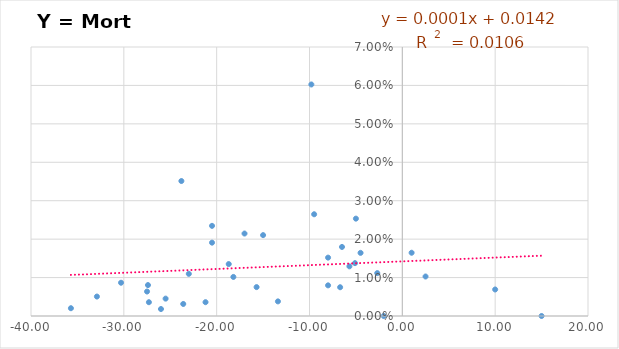
| Category | Y = Mort /año |
|---|---|
| 10.0 | 0.007 |
| -30.30000000000001 | 0.009 |
| -15.0 | 0.021 |
| -23.0 | 0.011 |
| -8.0 | 0.015 |
| -4.5 | 0.016 |
| -6.699999999999989 | 0.007 |
| -8.0 | 0.008 |
| -35.69999999999999 | 0.002 |
| -27.30000000000001 | 0.004 |
| -18.69999999999999 | 0.014 |
| -32.900000000000006 | 0.005 |
| -20.5 | 0.023 |
| -23.599999999999994 | 0.003 |
| -23.80000000000001 | 0.035 |
| -20.5 | 0.019 |
| -18.19999999999999 | 0.01 |
| -15.699999999999989 | 0.008 |
| 15.0 | 0 |
| -27.400000000000006 | 0.008 |
| -5.0 | 0.025 |
| -17.0 | 0.021 |
| 1.0 | 0.016 |
| 2.5 | 0.01 |
| -2.6999999999999886 | 0.011 |
| -2.0 | 0 |
| -26.0 | 0.002 |
| -25.5 | 0.005 |
| -5.699999999999989 | 0.013 |
| -27.5 | 0.006 |
| -9.5 | 0.026 |
| -21.19999999999999 | 0.004 |
| -9.800000000000011 | 0.06 |
| -6.5 | 0.018 |
| -5.099999999999994 | 0.014 |
| -13.400000000000006 | 0.004 |